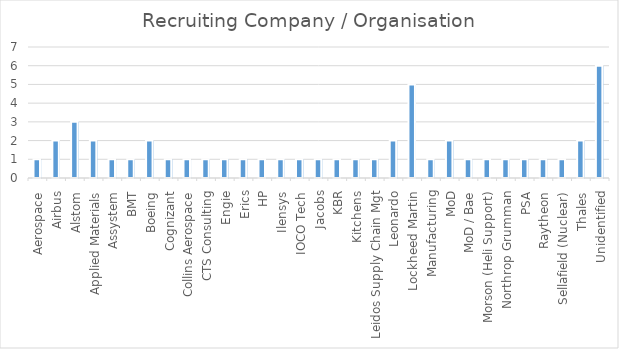
| Category | Qty |
|---|---|
| Aerospace | 1 |
| Airbus | 2 |
| Alstom | 3 |
| Applied Materials | 2 |
| Assystem | 1 |
| BMT | 1 |
| Boeing | 2 |
| Cognizant | 1 |
| Collins Aerospace | 1 |
| CTS Consulting | 1 |
| Engie | 1 |
| Erics | 1 |
| HP | 1 |
| Ilensys | 1 |
| IOCO Tech | 1 |
| Jacobs | 1 |
| KBR | 1 |
| Kitchens | 1 |
| Leidos Supply Chain Mgt | 1 |
| Leonardo | 2 |
| Lockheed Martin | 5 |
| Manufacturing | 1 |
| MoD | 2 |
| MoD / Bae | 1 |
| Morson (Heli Support) | 1 |
| Northrop Grumman | 1 |
| PSA | 1 |
| Raytheon | 1 |
| Sellafield (Nuclear) | 1 |
| Thales | 2 |
| Unidentified | 6 |